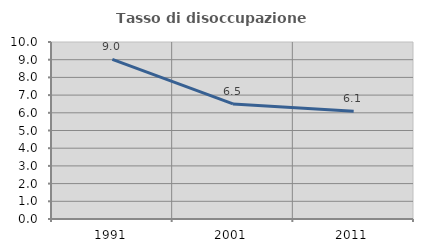
| Category | Tasso di disoccupazione giovanile  |
|---|---|
| 1991.0 | 9.021 |
| 2001.0 | 6.5 |
| 2011.0 | 6.087 |